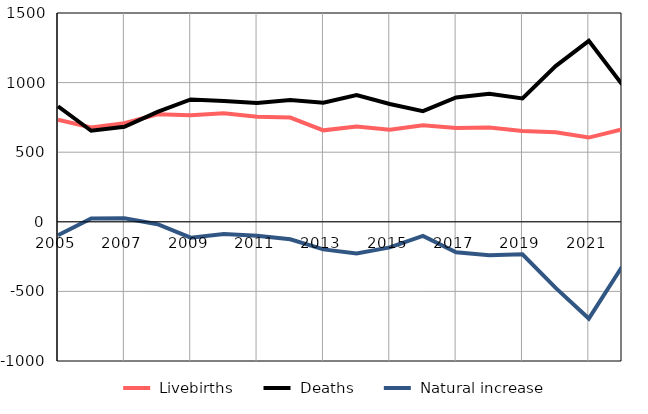
| Category |  Livebirths |  Deaths |  Natural increase |
|---|---|---|---|
| 2005.0 | 733 | 830 | -97 |
| 2006.0 | 678 | 654 | 24 |
| 2007.0 | 708 | 683 | 25 |
| 2008.0 | 773 | 790 | -17 |
| 2009.0 | 765 | 879 | -114 |
| 2010.0 | 780 | 867 | -87 |
| 2011.0 | 754 | 854 | -100 |
| 2012.0 | 749 | 875 | -126 |
| 2013.0 | 657 | 855 | -198 |
| 2014.0 | 684 | 911 | -227 |
| 2015.0 | 662 | 846 | -184 |
| 2016.0 | 694 | 795 | -101 |
| 2017.0 | 674 | 893 | -219 |
| 2018.0 | 678 | 919 | -241 |
| 2019.0 | 653 | 886 | -233 |
| 2020.0 | 644 | 1119 | -475 |
| 2021.0 | 605 | 1300 | -695 |
| 2022.0 | 664 | 987 | -323 |